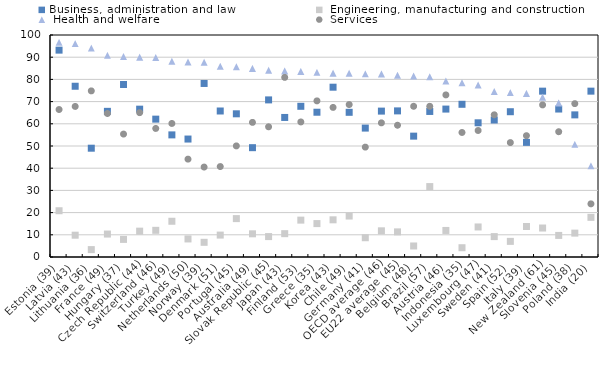
| Category | Business, administration and law  |  Engineering, manufacturing and construction  |  Health and welfare  |  Services  |
|---|---|---|---|---|
| Estonia (39) | 93.182 | 20.841 | 96.703 | 66.43 |
| Latvia (43) | 76.913 | 9.823 | 96.129 | 67.825 |
| Lithuania (36) | 49.008 | 3.329 | 94.118 | 74.823 |
| France (49) | 65.613 | 10.335 | 90.842 | 64.638 |
| Hungary (37) | 77.711 | 7.93 | 90.314 | 55.367 |
| Czech Republic (44) | 66.592 | 11.639 | 90.027 | 65.017 |
| Switzerland (46) | 62.096 | 12.016 | 89.871 | 57.909 |
| Turkey (49) | 55.008 | 16.102 | 88.152 | 60.154 |
| Netherlands (50) | 53.131 | 8.137 | 87.841 | 44.081 |
| Norway (39) | 78.172 | 6.616 | 87.675 | 40.509 |
| Denmark (51) | 65.768 | 9.87 | 85.947 | 40.737 |
| Portugal (45) | 64.499 | 17.294 | 85.682 | 50.04 |
| Australia (49) | 49.247 | 10.445 | 84.941 | 60.642 |
| Slovak Republic (45) | 70.769 | 9.195 | 84.141 | 58.642 |
| Japan (43) | 62.859 | 10.508 | 83.814 | 80.909 |
| Finland (53) | 67.883 | 16.611 | 83.59 | 60.831 |
| Greece (35) | 65.213 | 15.049 | 83.17 | 70.328 |
| Korea (43) | 76.489 | 16.752 | 82.811 | 67.385 |
| Chile (49) | 65.174 | 18.453 | 82.763 | 68.668 |
| Germany (41) | 58.067 | 8.681 | 82.491 | 49.5 |
| OECD average (46) | 65.717 | 11.795 | 82.486 | 60.42 |
| EU22 average (45) | 65.816 | 11.315 | 81.879 | 59.354 |
| Belgium (48) | 54.44 | 4.966 | 81.508 | 67.893 |
| Brazil (57) | 65.561 | 31.722 | 81.173 | 67.876 |
| Austria (46) | 66.632 | 11.959 | 79.241 | 73.01 |
| Indonesia (35) | 68.787 | 4.176 | 78.544 | 56.085 |
| Luxembourg (47) | 60.452 | 13.53 | 77.457 | 56.983 |
| Sweden (41) | 61.704 | 9.185 | 74.587 | 64.047 |
| Spain (52) | 65.442 | 7.038 | 74.054 | 51.531 |
| Italy (39) | 51.631 | 13.745 | 73.688 | 54.657 |
| New Zealand (61) | 74.706 | 13.055 | 72.006 | 68.507 |
| Slovenia (45) | 66.651 | 9.721 | 69.393 | 56.438 |
| Poland (38) | 64.023 | 10.752 | 50.769 | 69.084 |
| India (20) | 74.708 | 17.87 | 41.077 | 23.944 |